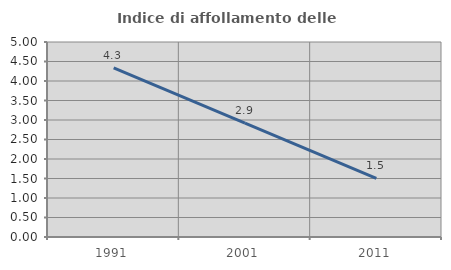
| Category | Indice di affollamento delle abitazioni  |
|---|---|
| 1991.0 | 4.334 |
| 2001.0 | 2.922 |
| 2011.0 | 1.501 |